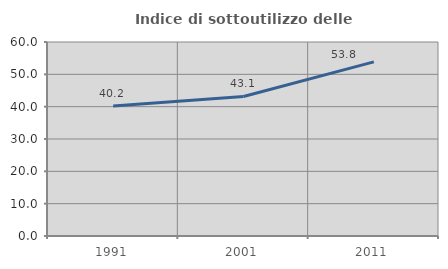
| Category | Indice di sottoutilizzo delle abitazioni  |
|---|---|
| 1991.0 | 40.181 |
| 2001.0 | 43.146 |
| 2011.0 | 53.846 |